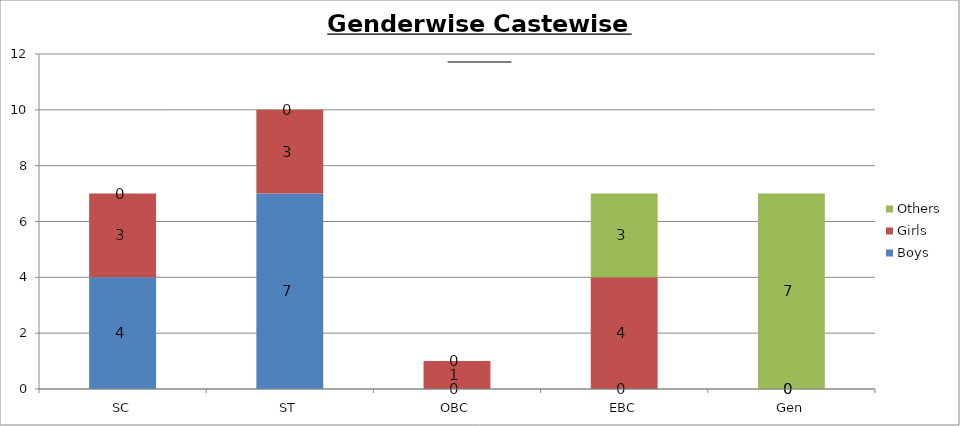
| Category | Boys | Girls | Others |
|---|---|---|---|
| SC | 4 | 3 | 0 |
| ST | 7 | 3 | 0 |
| OBC | 0 | 1 | 0 |
| EBC | 0 | 4 | 3 |
| Gen | 0 | 0 | 7 |